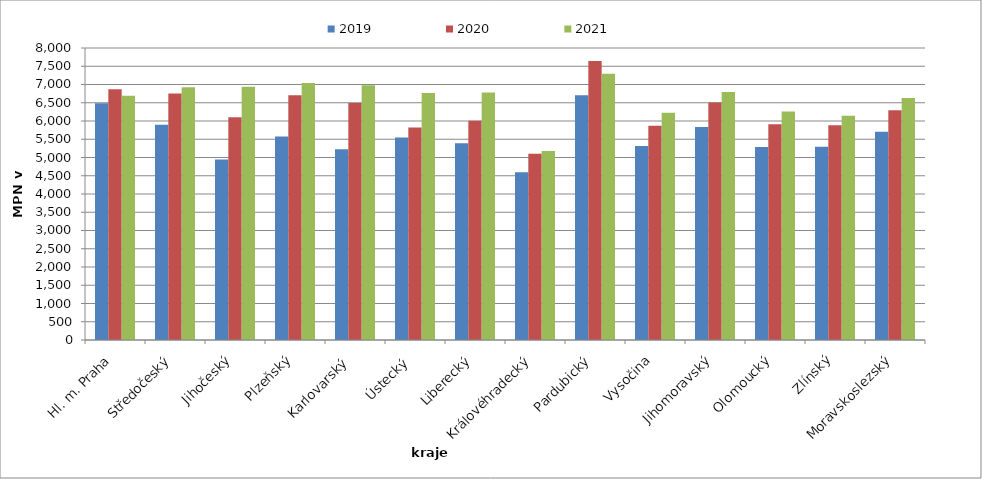
| Category | 2019 | 2020 | 2021 |
|---|---|---|---|
| Hl. m. Praha | 6489 | 6871 | 6689 |
| Středočeský | 5898 | 6756 | 6927 |
| Jihočeský | 4943 | 6100 | 6939 |
| Plzeňský | 5576 | 6707 | 7042 |
| Karlovarský  | 5229 | 6493 | 6981 |
| Ústecký   | 5548 | 5819 | 6767 |
| Liberecký | 5390 | 6004 | 6782 |
| Královéhradecký | 4595 | 5101 | 5180 |
| Pardubický | 6705 | 7643 | 7296 |
| Vysočina | 5318 | 5867 | 6226 |
| Jihomoravský | 5837 | 6509 | 6792 |
| Olomoucký | 5285 | 5909 | 6263 |
| Zlínský | 5292 | 5884 | 6142 |
| Moravskoslezský | 5705 | 6296 | 6633 |